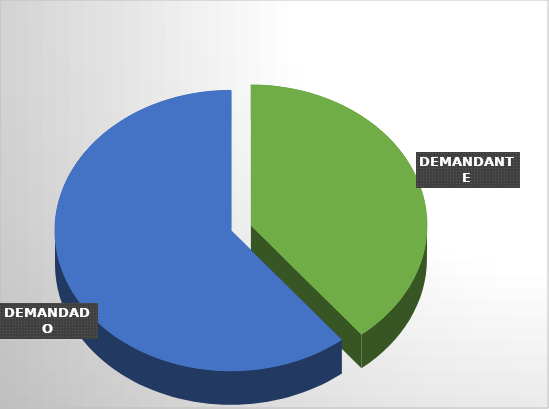
| Category | Series 0 | Series 1 |
|---|---|---|
| DEMANDANTE | 29 | 2902434917 |
| DEMANDADO | 45 | 2602595440467 |